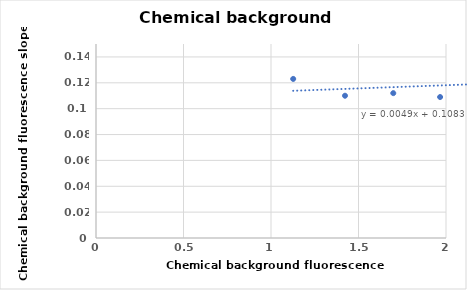
| Category | Series 0 |
|---|---|
| 1.1268 | 0.123 |
| 1.4229 | 0.11 |
| 1.6987 | 0.112 |
| 1.9663 | 0.109 |
| 2.2502 | 0.128 |
| 2.5399 | 0.121 |
| 2.8271 | 0.124 |